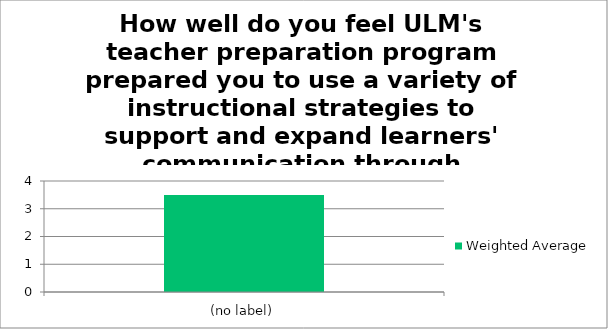
| Category | Weighted Average |
|---|---|
| (no label) | 3.5 |